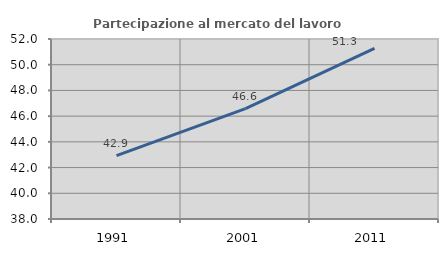
| Category | Partecipazione al mercato del lavoro  femminile |
|---|---|
| 1991.0 | 42.924 |
| 2001.0 | 46.589 |
| 2011.0 | 51.268 |